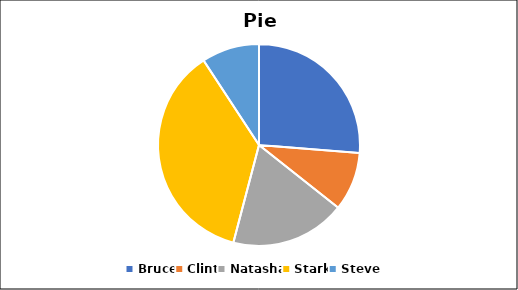
| Category | Total Sales |
|---|---|
| Bruce | 4140 |
| Clint | 1480 |
| Natasha | 2905 |
| Stark | 5780 |
| Steve | 1455 |